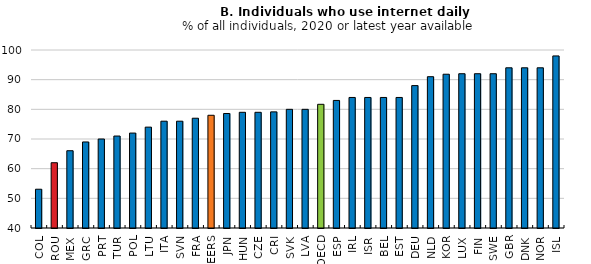
| Category | Series 0 |
|---|---|
| COL | 53.069 |
| ROU | 62 |
| MEX | 66.048 |
| GRC | 69 |
| PRT | 70 |
| TUR | 71 |
| POL | 72 |
| LTU | 74 |
| ITA | 76 |
| SVN | 76 |
| FRA | 77 |
| PEERS | 78 |
| JPN | 78.6 |
| HUN | 79 |
| CZE | 79 |
| CRI | 79.146 |
| SVK | 80 |
| LVA | 80 |
| OECD | 81.695 |
| ESP | 83 |
| IRL | 84 |
| ISR | 84 |
| BEL | 84 |
| EST | 84 |
| DEU | 88 |
| NLD | 91 |
| KOR | 91.836 |
| LUX | 92 |
| FIN | 92 |
| SWE | 92 |
| GBR | 94 |
| DNK | 94 |
| NOR | 94 |
| ISL | 98 |